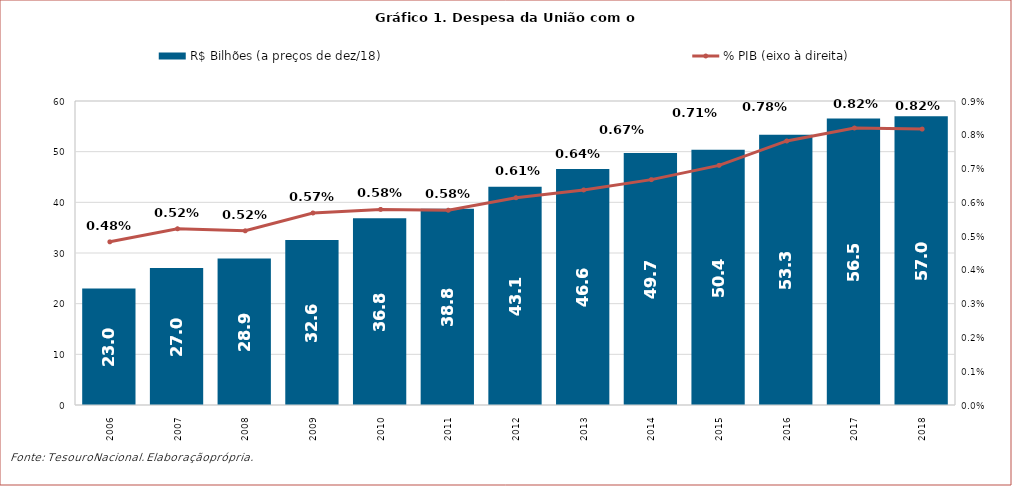
| Category | R$ Bilhões (a preços de dez/18) |
|---|---|
| 2006.0 | 22.993 |
| 2007.0 | 27.026 |
| 2008.0 | 28.92 |
| 2009.0 | 32.582 |
| 2010.0 | 36.846 |
| 2011.0 | 38.755 |
| 2012.0 | 43.057 |
| 2013.0 | 46.586 |
| 2014.0 | 49.737 |
| 2015.0 | 50.362 |
| 2016.0 | 53.317 |
| 2017.0 | 56.54 |
| 2018.0 | 56.995 |